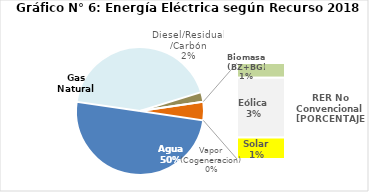
| Category | Series 0 |
|---|---|
| Agua | 2222.399 |
| Gas Natural | 1910.518 |
| Diesel/Residual/Carbón | 107.607 |
| Vapor (Cogeneracion) | 0.146 |
| Biomasa (BZ+BG) | 32.062 |
| Eólica | 129.267 |
| Solar | 46.716 |